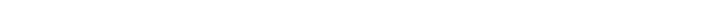
| Category | Avant redistribution | Après redistribution |
|---|---|---|
| 0 | 1 | 1 |